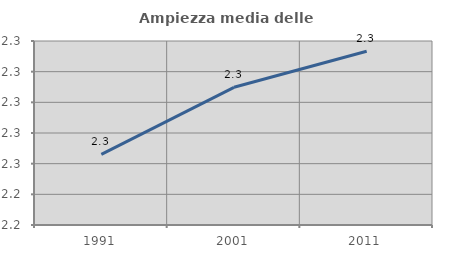
| Category | Ampiezza media delle famiglie |
|---|---|
| 1991.0 | 2.266 |
| 2001.0 | 2.31 |
| 2011.0 | 2.333 |